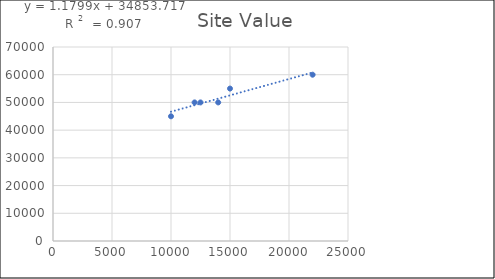
| Category | Series 0 |
|---|---|
| 12500.0 | 50000 |
| 15000.0 | 55000 |
| 10000.0 | 45000 |
| 14000.0 | 50000 |
| 12000.0 | 50000 |
| 22000.0 | 60000 |